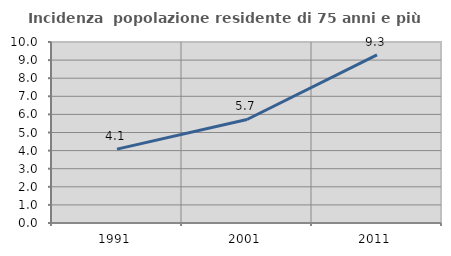
| Category | Incidenza  popolazione residente di 75 anni e più |
|---|---|
| 1991.0 | 4.083 |
| 2001.0 | 5.719 |
| 2011.0 | 9.292 |